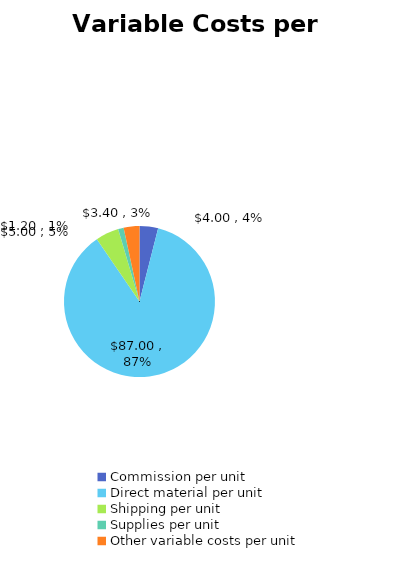
| Category | Series 0 |
|---|---|
| Commission per unit | 4 |
| Direct material per unit | 87 |
| Shipping per unit | 5 |
| Supplies per unit | 1.2 |
| Other variable costs per unit | 3.4 |